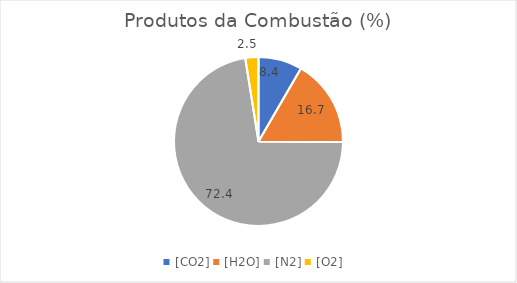
| Category | Series 0 |
|---|---|
| [CO2] | 8.37 |
| [H2O] | 16.739 |
| [N2] | 72.38 |
| [O2] | 2.511 |